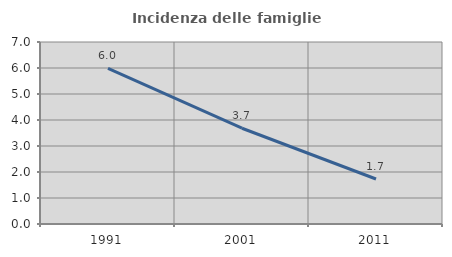
| Category | Incidenza delle famiglie numerose |
|---|---|
| 1991.0 | 5.984 |
| 2001.0 | 3.683 |
| 2011.0 | 1.731 |